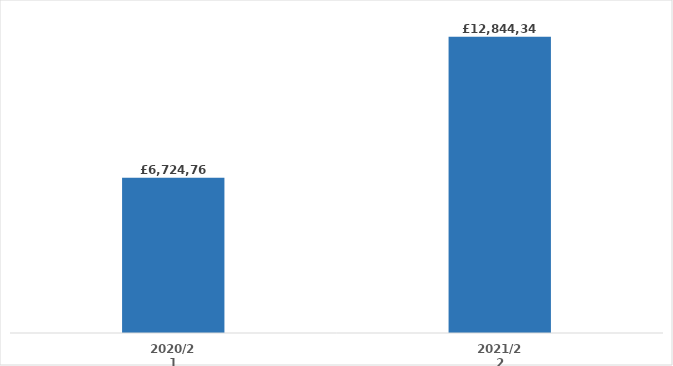
| Category | Series 0 |
|---|---|
| 2020/21 | 6724762.2 |
| 2021/22 | 12844340.07 |